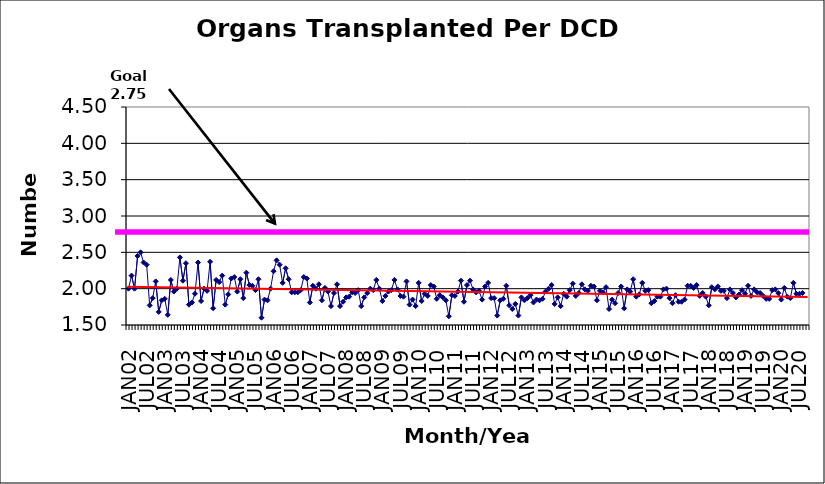
| Category | Series 0 |
|---|---|
| JAN02 | 2 |
| FEB02 | 2.18 |
| MAR02 | 2 |
| APR02 | 2.45 |
| MAY02 | 2.5 |
| JUN02 | 2.36 |
| JUL02 | 2.33 |
| AUG02 | 1.77 |
| SEP02 | 1.87 |
| OCT02 | 2.1 |
| NOV02 | 1.68 |
| DEC02 | 1.84 |
| JAN03 | 1.86 |
| FEB03 | 1.64 |
| MAR03 | 2.12 |
| APR03 | 1.96 |
| MAY03 | 2 |
| JUN03 | 2.43 |
| JUL03 | 2.11 |
| AUG03 | 2.35 |
| SEP03 | 1.78 |
| OCT03 | 1.81 |
| NOV03 | 1.93 |
| DEC03 | 2.36 |
| JAN04 | 1.83 |
| FEB04 | 2 |
| MAR04 | 1.97 |
| APR04 | 2.37 |
| MAY04 | 1.73 |
| JUN04 | 2.12 |
| JUL04 | 2.09 |
| AUG04 | 2.18 |
| SEP04 | 1.78 |
| OCT04 | 1.92 |
| NOV04 | 2.14 |
| DEC04 | 2.16 |
| JAN05 | 1.96 |
| FEB05 | 2.13 |
| MAR05 | 1.87 |
| APR05 | 2.22 |
| MAY05 | 2.05 |
| JUN05 | 2.04 |
| JUL05 | 1.98 |
| AUG05 | 2.13 |
| SEP05 | 1.6 |
| OCT05 | 1.85 |
| NOV05 | 1.84 |
| DEC05 | 2 |
| JAN06 | 2.24 |
| FEB06 | 2.39 |
| MAR06 | 2.33 |
| APR06 | 2.08 |
| MAY06 | 2.28 |
| JUN06 | 2.13 |
| JUL06 | 1.95 |
| AUG06 | 1.95 |
| SEP06 | 1.95 |
| OCT06 | 1.98 |
| NOV06 | 2.16 |
| DEC06 | 2.14 |
| JAN07 | 1.81 |
| FEB07 | 2.04 |
| MAR07 | 2 |
| APR07 | 2.06 |
| MAY07 | 1.84 |
| JUN07 | 2.01 |
| JUL07 | 1.96 |
| AUG07 | 1.76 |
| SEP07 | 1.94 |
| OCT07 | 2.06 |
| NOV07 | 1.76 |
| DEC07 | 1.82 |
| JAN08 | 1.88 |
| FEB08 | 1.89 |
| MAR08 | 1.95 |
| APR08 | 1.94 |
| MAY08 | 1.98 |
| JUN08 | 1.76 |
| JUL08 | 1.88 |
| AUG08 | 1.94 |
| SEP08 | 2 |
| OCT08 | 1.98 |
| NOV08 | 2.12 |
| DEC08 | 2 |
| JAN09 | 1.83 |
| FEB09 | 1.9 |
| MAR09 | 1.96 |
| APR09 | 1.98 |
| MAY09 | 2.12 |
| JUN09 | 1.99 |
| JUL09 | 1.9 |
| AUG09 | 1.89 |
| SEP09 | 2.1 |
| OCT09 | 1.78 |
| NOV09 | 1.85 |
| DEC09 | 1.76 |
| JAN10 | 2.08 |
| FEB10 | 1.83 |
| MAR10 | 1.93 |
| APR10 | 1.9 |
| MAY10 | 2.05 |
| JUN10 | 2.03 |
| JUL10 | 1.86 |
| AUG10 | 1.91 |
| SEP10 | 1.88 |
| OCT10 | 1.84 |
| NOV10 | 1.62 |
| DEC10 | 1.91 |
| JAN11 | 1.9 |
| FEB11 | 1.96 |
| MAR11 | 2.11 |
| APR11 | 1.82 |
| MAY11 | 2.05 |
| JUN11 | 2.11 |
| JUL11 | 1.99 |
| AUG11 | 1.95 |
| SEP11 | 1.97 |
| OCT11 | 1.85 |
| NOV11 | 2.03 |
| DEC11 | 2.08 |
| JAN12 | 1.87 |
| FEB12 | 1.87 |
| MAR12 | 1.63 |
| APR12 | 1.84 |
| MAY12 | 1.86 |
| JUN12 | 2.04 |
| JUL12 | 1.77 |
| AUG12 | 1.72 |
| SEP12 | 1.79 |
| OCT12 | 1.63 |
| NOV12 | 1.88 |
| DEC12 | 1.84 |
| JAN13 | 1.87 |
| FEB13 | 1.91 |
| MAR13 | 1.81 |
| APR13 | 1.85 |
| MAY13 | 1.84 |
| JUN13 | 1.86 |
| JUL13 | 1.96 |
| AUG13 | 2 |
| SEP13 | 2.05 |
| OCT13 | 1.79 |
| NOV13 | 1.88 |
| DEC13 | 1.76 |
| JAN14 | 1.93 |
| FEB14 | 1.89 |
| MAR14 | 1.98 |
| APR14 | 2.07 |
| MAY14 | 1.9 |
| JUN14 | 1.94 |
| JUL14 | 2.06 |
| AUG14 | 1.99 |
| SEP14 | 1.97 |
| OCT14 | 2.04 |
| NOV14 | 2.03 |
| DEC14 | 1.84 |
| JAN15 | 1.97 |
| FEB15 | 1.95 |
| MAR15 | 2.02 |
| APR15 | 1.72 |
| MAY15 | 1.85 |
| JUN15 | 1.8 |
| JUL15 | 1.94 |
| AUG15 | 2.03 |
| SEP15 | 1.73 |
| OCT15 | 1.99 |
| NOV15 | 1.96 |
| DEC15 | 2.13 |
| JAN16 | 1.89 |
| FEB16 | 1.92 |
| MAR16 | 2.08 |
| APR16 | 1.97 |
| MAY16 | 1.98 |
| JUN16 | 1.8 |
| JUL16 | 1.83 |
| AUG16 | 1.89 |
| SEP16 | 1.89 |
| OCT16 | 1.99 |
| NOV16 | 2 |
| DEC16 | 1.87 |
| JAN17 | 1.8 |
| FEB17 | 1.91 |
| MAR17 | 1.82 |
| APR17 | 1.82 |
| MAY17 | 1.85 |
| JUN17 | 2.04 |
| JUL17 | 2.04 |
| AUG17 | 2.01 |
| SEP17 | 2.05 |
| OCT17 | 1.9 |
| NOV17 | 1.94 |
| DEC17 | 1.89 |
| JAN18 | 1.77 |
| FEB18 | 2.02 |
| MAR18 | 1.99 |
| APR18 | 2.03 |
| MAY18 | 1.97 |
| JUN18 | 1.97 |
| JUL18 | 1.87 |
| AUG18 | 1.99 |
| SEP18 | 1.94 |
| OCT18 | 1.88 |
| NOV18 | 1.92 |
| DEC18 | 1.98 |
| JAN19 | 1.93 |
| FEB19 | 2.04 |
| MAR19 | 1.9 |
| APR19 | 1.99 |
| MAY19 | 1.95 |
| JUN19 | 1.94 |
| JUL19 | 1.9 |
| AUG19 | 1.86 |
| SEP19 | 1.86 |
| OCT19 | 1.98 |
| NOV19 | 1.99 |
| DEC19 | 1.94 |
| JAN20 | 1.85 |
| FEB20 | 2.01 |
| MAR20 | 1.89 |
| APR20 | 1.87 |
| MAY20 | 2.08 |
| JUN20 | 1.93 |
| JUL20 | 1.93 |
| AUG20 | 1.94 |